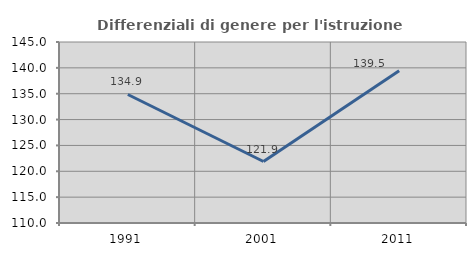
| Category | Differenziali di genere per l'istruzione superiore |
|---|---|
| 1991.0 | 134.852 |
| 2001.0 | 121.888 |
| 2011.0 | 139.458 |